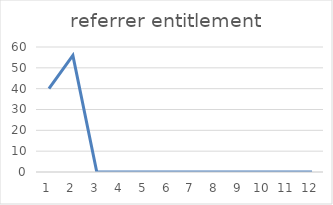
| Category | referrer entitlement |
|---|---|
| 0 | 40 |
| 1 | 56 |
| 2 | 0 |
| 3 | 0 |
| 4 | 0 |
| 5 | 0 |
| 6 | 0 |
| 7 | 0 |
| 8 | 0 |
| 9 | 0 |
| 10 | 0 |
| 11 | 0 |